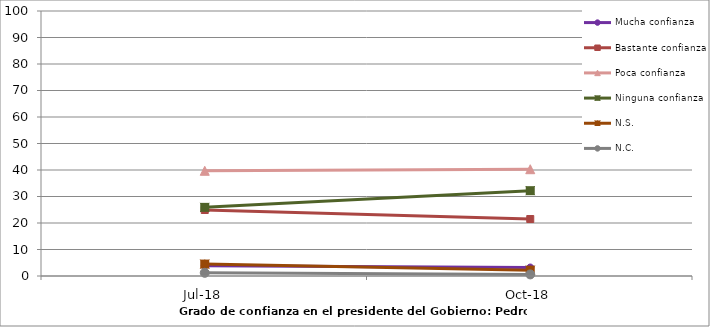
| Category | Mucha confianza | Bastante confianza | Poca confianza | Ninguna confianza | N.S. | N.C. |
|---|---|---|---|---|---|---|
| 2018-07-01 | 3.9 | 24.9 | 39.7 | 25.9 | 4.5 | 1.2 |
| 2018-10-01 | 3.2 | 21.5 | 40.3 | 32.2 | 2.2 | 0.6 |